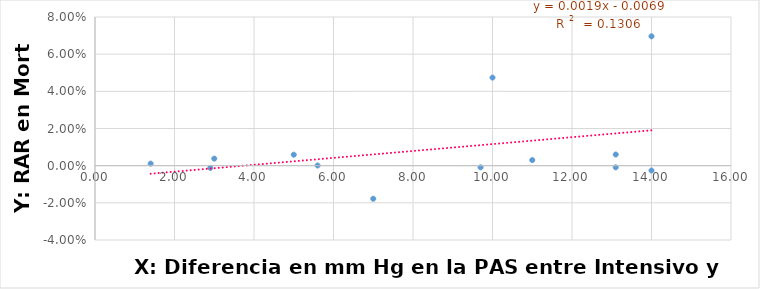
| Category | Y = RAR en MortCV |
|---|---|
| 2.9 | -0.001 |
| 10.0 | 0.047 |
| 7.0 | -0.018 |
| 5.0 | 0.006 |
| 9.7 | -0.001 |
| 13.1 | -0.001 |
| 5.6 | 0 |
| 14.0 | -0.003 |
| 1.4 | 0.001 |
| 14.0 | 0.07 |
| 11.0 | 0.003 |
| 13.1 | 0.006 |
| 3.0 | 0.004 |